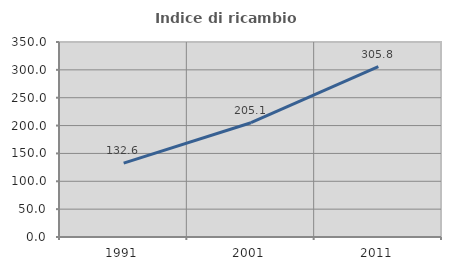
| Category | Indice di ricambio occupazionale  |
|---|---|
| 1991.0 | 132.65 |
| 2001.0 | 205.092 |
| 2011.0 | 305.828 |